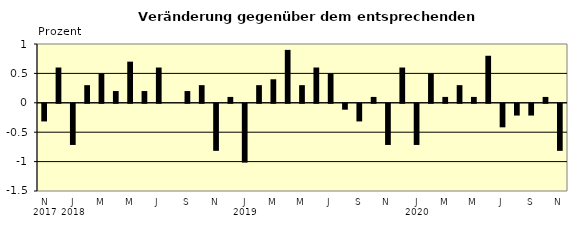
| Category | Series 0 |
|---|---|
| 0 | -0.3 |
| 1 | 0.6 |
| 2 | -0.7 |
| 3 | 0.3 |
| 4 | 0.5 |
| 5 | 0.2 |
| 6 | 0.7 |
| 7 | 0.2 |
| 8 | 0.6 |
| 9 | 0 |
| 10 | 0.2 |
| 11 | 0.3 |
| 12 | -0.8 |
| 13 | 0.1 |
| 14 | -1 |
| 15 | 0.3 |
| 16 | 0.4 |
| 17 | 0.9 |
| 18 | 0.3 |
| 19 | 0.6 |
| 20 | 0.5 |
| 21 | -0.1 |
| 22 | -0.3 |
| 23 | 0.1 |
| 24 | -0.7 |
| 25 | 0.6 |
| 26 | -0.7 |
| 27 | 0.5 |
| 28 | 0.1 |
| 29 | 0.3 |
| 30 | 0.1 |
| 31 | 0.8 |
| 32 | -0.4 |
| 33 | -0.2 |
| 34 | -0.2 |
| 35 | 0.1 |
| 36 | -0.8 |